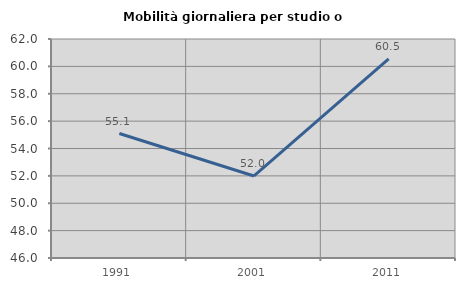
| Category | Mobilità giornaliera per studio o lavoro |
|---|---|
| 1991.0 | 55.093 |
| 2001.0 | 51.993 |
| 2011.0 | 60.542 |